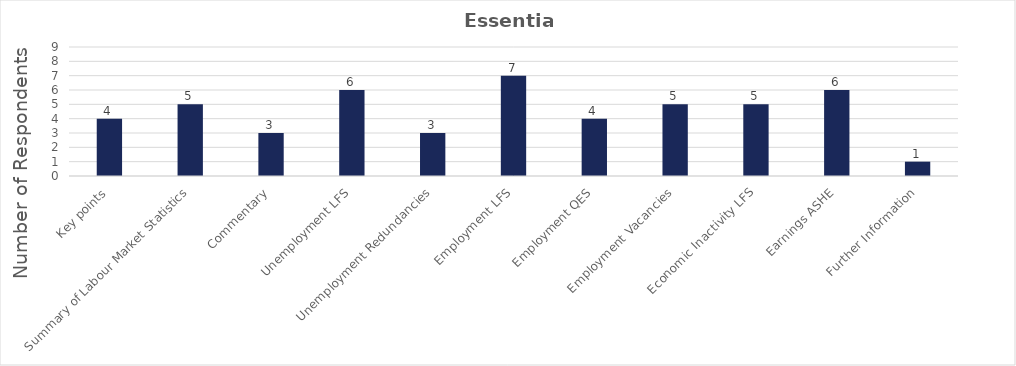
| Category | Essential |
|---|---|
| Key points | 4 |
| Summary of Labour Market Statistics | 5 |
| Commentary | 3 |
| Unemployment LFS | 6 |
| Unemployment Redundancies | 3 |
| Employment LFS | 7 |
| Employment QES | 4 |
| Employment Vacancies | 5 |
| Economic Inactivity LFS | 5 |
| Earnings ASHE | 6 |
| Further Information | 1 |